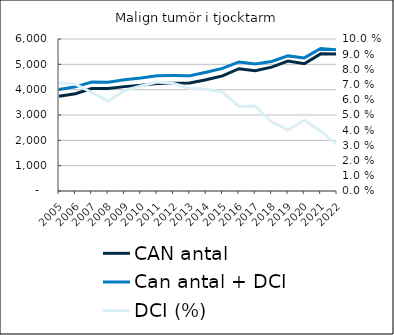
| Category |  CAN antal  |  Can antal + DCI  |
|---|---|---|
| 2005.0 | 3743 | 4010 |
| 2006.0 | 3842 | 4112 |
| 2007.0 | 4042 | 4304 |
| 2008.0 | 4050 | 4290 |
| 2009.0 | 4120 | 4392 |
| 2010.0 | 4172 | 4460 |
| 2011.0 | 4243 | 4547 |
| 2012.0 | 4254 | 4555 |
| 2013.0 | 4262 | 4550 |
| 2014.0 | 4391 | 4685 |
| 2015.0 | 4545 | 4841 |
| 2016.0 | 4826 | 5094 |
| 2017.0 | 4745 | 5010 |
| 2018.0 | 4890 | 5112 |
| 2019.0 | 5127 | 5333 |
| 2020.0 | 5021 | 5255 |
| 2021.0 | 5413 | 5626 |
| 2022.0 | 5412 | 5577 |